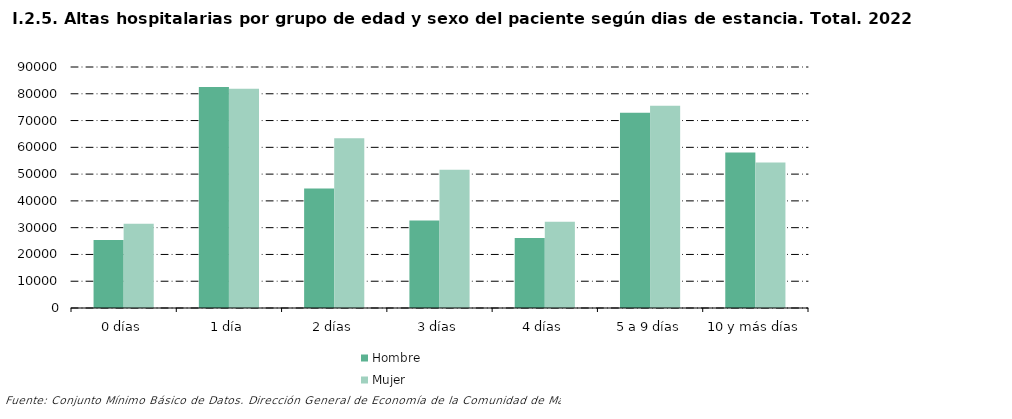
| Category |     Hombre |     Mujer |
|---|---|---|
| 0 | 25384 | 31423 |
| 1 | 82496 | 81886 |
| 2 | 44636 | 63416 |
| 3 | 32706 | 51627 |
| 4 | 26129 | 32241 |
| 5 | 72893 | 75498 |
| 6 | 58112 | 54364 |